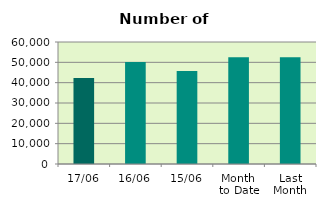
| Category | Series 0 |
|---|---|
| 17/06 | 42340 |
| 16/06 | 50130 |
| 15/06 | 45690 |
| Month 
to Date | 52449.692 |
| Last
Month | 52506.1 |